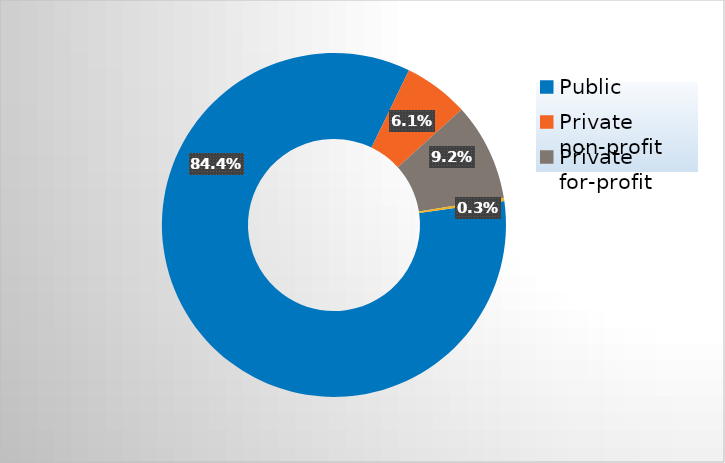
| Category | Series 0 |
|---|---|
| Public | 0.844 |
| Private non-profit | 0.061 |
| Private for-profit | 0.092 |
| Private, state-related | 0.003 |